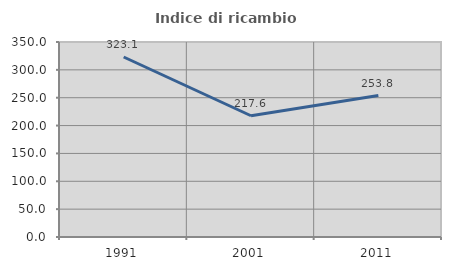
| Category | Indice di ricambio occupazionale  |
|---|---|
| 1991.0 | 323.077 |
| 2001.0 | 217.647 |
| 2011.0 | 253.846 |